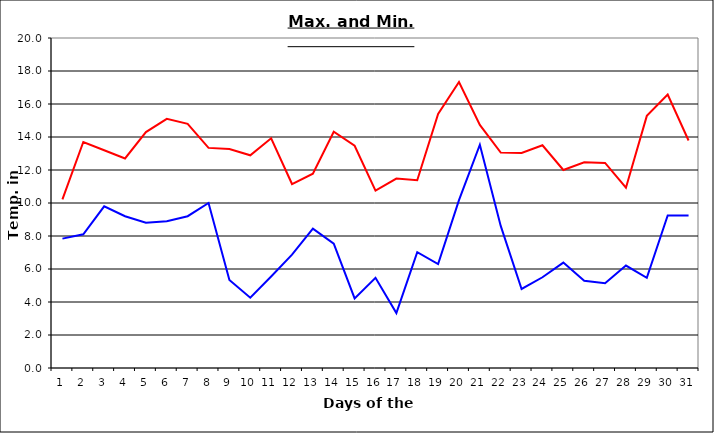
| Category | Series 0 | Series 1 |
|---|---|---|
| 0 | 10.22 | 7.84 |
| 1 | 13.7 | 8.1 |
| 2 | 13.2 | 9.8 |
| 3 | 12.7 | 9.2 |
| 4 | 14.3 | 8.8 |
| 5 | 15.1 | 8.9 |
| 6 | 14.8 | 9.2 |
| 7 | 13.34 | 10 |
| 8 | 13.27 | 5.33 |
| 9 | 12.89 | 4.26 |
| 10 | 13.92 | 5.55 |
| 11 | 11.15 | 6.87 |
| 12 | 11.78 | 8.45 |
| 13 | 14.32 | 7.54 |
| 14 | 13.47 | 4.22 |
| 15 | 10.75 | 5.47 |
| 16 | 11.48 | 3.33 |
| 17 | 11.38 | 7.02 |
| 18 | 15.4 | 6.3 |
| 19 | 17.33 | 10.17 |
| 20 | 14.73 | 13.53 |
| 21 | 13.06 | 8.61 |
| 22 | 13.03 | 4.79 |
| 23 | 13.5 | 5.5 |
| 24 | 12 | 6.39 |
| 25 | 12.47 | 5.29 |
| 26 | 12.43 | 5.14 |
| 27 | 10.93 | 6.21 |
| 28 | 15.28 | 5.47 |
| 29 | 16.57 | 9.25 |
| 30 | 13.79 | 9.25 |